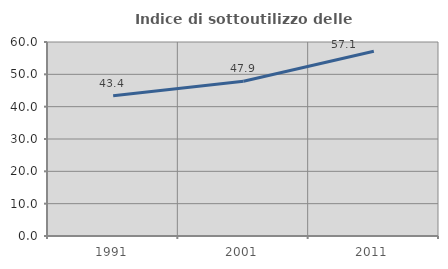
| Category | Indice di sottoutilizzo delle abitazioni  |
|---|---|
| 1991.0 | 43.367 |
| 2001.0 | 47.881 |
| 2011.0 | 57.143 |